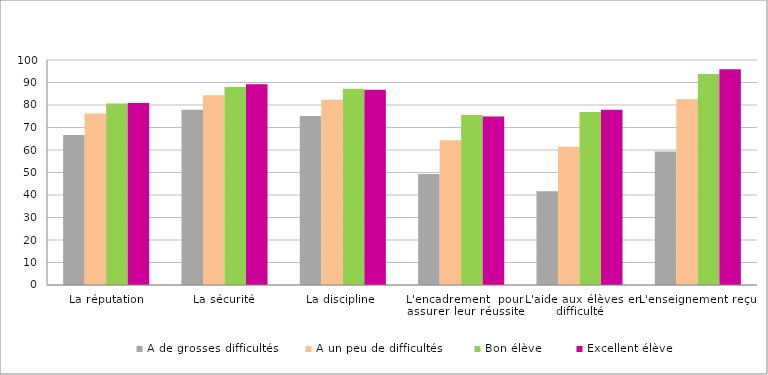
| Category | A de grosses difficultés | A un peu de difficultés  | Bon élève  | Excellent élève  |
|---|---|---|---|---|
| La réputation | 66.64 | 76.17 | 80.72 | 80.85 |
| La sécurité | 77.93 | 84.34 | 87.96 | 89.25 |
| La discipline  | 75.09 | 82.37 | 87.17 | 86.75 |
| L'encadrement  pour assurer leur réussite | 49.37 | 64.29 | 75.51 | 74.87 |
| L'aide aux élèves en difficulté | 41.72 | 61.48 | 76.93 | 77.91 |
| L'enseignement reçu | 59.35 | 82.57 | 93.81 | 95.94 |